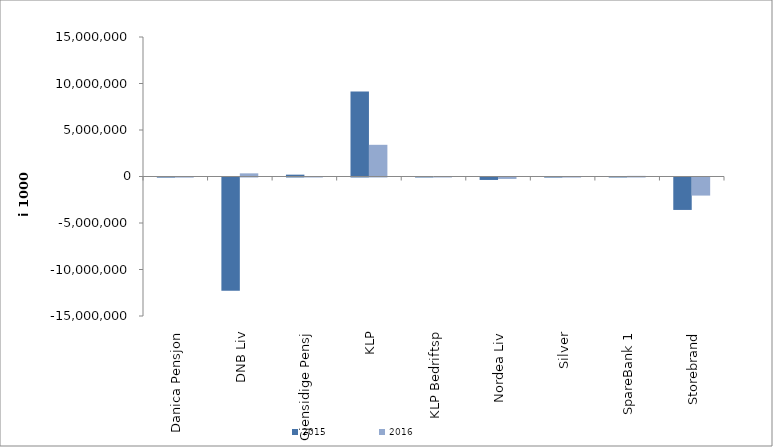
| Category | 2015 | 2016 |
|---|---|---|
| 0 | -12954.838 | -13818.659 |
| 1 | -12175688 | 339103 |
| 2 | 197849.619 | 13427.598 |
| 3 | 9134487.721 | 3407665.299 |
| 4 | 1934 | 1186 |
| 5 | -263544.455 | -152886.35 |
| 6 | -9671.376 | -7054.664 |
| 7 | 52840.886 | 66489.531 |
| 8 | -3487698.561 | -1944428.414 |